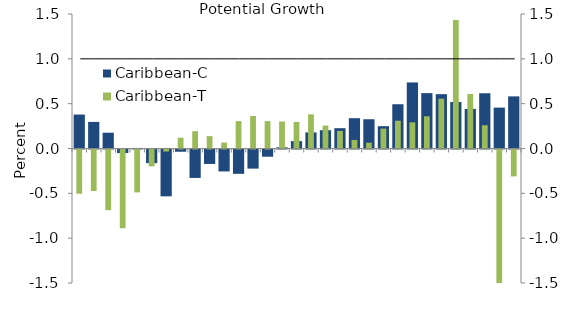
| Category | Caribbean-C |
|---|---|
| 1980.0 | 0.379 |
| 1981.0 | 0.296 |
| 1982.0 | 0.176 |
| 1983.0 | -0.04 |
| 1984.0 | 0.006 |
| 1985.0 | -0.152 |
| 1986.0 | -0.522 |
| 1987.0 | -0.025 |
| 1988.0 | -0.317 |
| 1989.0 | -0.161 |
| 1990.0 | -0.245 |
| 1991.0 | -0.271 |
| 1992.0 | -0.213 |
| 1993.0 | -0.08 |
| 1994.0 | 0.013 |
| 1995.0 | 0.082 |
| 1996.0 | 0.18 |
| 1997.0 | 0.204 |
| 1998.0 | 0.227 |
| 1999.0 | 0.338 |
| 2000.0 | 0.326 |
| 2001.0 | 0.249 |
| 2002.0 | 0.494 |
| 2003.0 | 0.737 |
| 2004.0 | 0.617 |
| 2005.0 | 0.606 |
| 2006.0 | 0.518 |
| 2007.0 | 0.441 |
| 2008.0 | 0.616 |
| 2009.0 | 0.456 |
| 2010.0 | 0.581 |